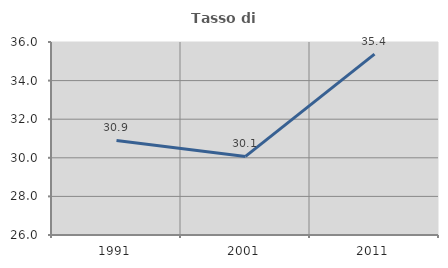
| Category | Tasso di occupazione   |
|---|---|
| 1991.0 | 30.899 |
| 2001.0 | 30.072 |
| 2011.0 | 35.371 |